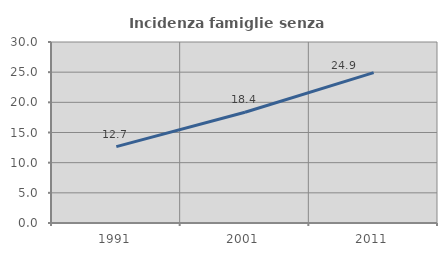
| Category | Incidenza famiglie senza nuclei |
|---|---|
| 1991.0 | 12.656 |
| 2001.0 | 18.361 |
| 2011.0 | 24.926 |